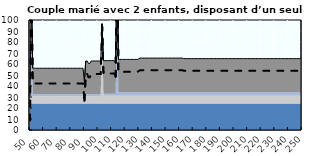
| Category | Coin fiscal marginal (somme des composantes) | Taux d’imposition marginal net |
|---|---|---|
| 50.0 | 30.605 | 8.69 |
| 51.0 | 131.577 | 141.549 |
| 52.0 | 56.131 | 42.277 |
| 53.0 | 56.131 | 42.277 |
| 54.0 | 56.131 | 42.277 |
| 55.0 | 56.131 | 42.277 |
| 56.0 | 56.131 | 42.277 |
| 57.0 | 56.131 | 42.277 |
| 58.0 | 56.131 | 42.277 |
| 59.0 | 56.131 | 42.277 |
| 60.0 | 56.131 | 42.277 |
| 61.0 | 56.131 | 42.277 |
| 62.0 | 56.131 | 42.277 |
| 63.0 | 56.131 | 42.277 |
| 64.0 | 56.131 | 42.277 |
| 65.0 | 56.131 | 42.277 |
| 66.0 | 56.131 | 42.277 |
| 67.0 | 56.131 | 42.277 |
| 68.0 | 56.131 | 42.277 |
| 69.0 | 56.131 | 42.277 |
| 70.0 | 56.131 | 42.277 |
| 71.0 | 56.131 | 42.277 |
| 72.0 | 56.131 | 42.277 |
| 73.0 | 56.131 | 42.277 |
| 74.0 | 56.131 | 42.277 |
| 75.0 | 56.131 | 42.277 |
| 76.0 | 56.131 | 42.277 |
| 77.0 | 56.131 | 42.277 |
| 78.0 | 56.131 | 42.277 |
| 79.0 | 56.131 | 42.277 |
| 80.0 | 56.131 | 42.277 |
| 81.0 | 56.131 | 42.277 |
| 82.0 | 56.131 | 42.277 |
| 83.0 | 56.131 | 42.277 |
| 84.0 | 56.131 | 42.277 |
| 85.0 | 56.131 | 42.277 |
| 86.0 | 56.131 | 42.277 |
| 87.0 | 56.131 | 42.277 |
| 88.0 | 56.131 | 42.277 |
| 89.0 | 56.131 | 42.277 |
| 90.0 | 44.333 | 26.753 |
| 91.0 | 62.743 | 50.977 |
| 92.0 | 62.743 | 50.977 |
| 93.0 | 60.498 | 48.024 |
| 94.0 | 60.498 | 48.024 |
| 95.0 | 62.743 | 50.977 |
| 96.0 | 62.743 | 50.977 |
| 97.0 | 62.743 | 50.977 |
| 98.0 | 62.743 | 50.977 |
| 99.0 | 62.743 | 50.977 |
| 100.0 | 62.743 | 50.977 |
| 101.0 | 62.743 | 50.977 |
| 102.0 | 62.743 | 50.977 |
| 103.0 | 96.691 | 95.646 |
| 104.0 | 63.069 | 51.407 |
| 105.0 | 63.069 | 51.407 |
| 106.0 | 63.069 | 51.407 |
| 107.0 | 63.069 | 51.407 |
| 108.0 | 63.069 | 51.407 |
| 109.0 | 63.069 | 51.407 |
| 110.0 | 63.069 | 51.407 |
| 111.0 | 63.069 | 51.407 |
| 112.0 | 63.069 | 51.407 |
| 113.0 | 60.825 | 48.453 |
| 114.0 | 157.087 | 175.115 |
| 115.0 | 64.17 | 52.855 |
| 116.0 | 64.17 | 52.855 |
| 117.0 | 64.17 | 52.855 |
| 118.0 | 64.17 | 52.855 |
| 119.0 | 64.17 | 52.855 |
| 120.0 | 64.17 | 52.855 |
| 121.0 | 64.17 | 52.855 |
| 122.0 | 64.17 | 52.855 |
| 123.0 | 64.17 | 52.855 |
| 124.0 | 64.17 | 52.855 |
| 125.0 | 64.17 | 52.855 |
| 126.0 | 64.17 | 52.855 |
| 127.0 | 64.17 | 52.855 |
| 128.0 | 64.17 | 52.855 |
| 129.0 | 64.17 | 52.855 |
| 130.0 | 64.716 | 53.573 |
| 131.0 | 65.357 | 54.416 |
| 132.0 | 65.357 | 54.416 |
| 133.0 | 65.357 | 54.416 |
| 134.0 | 65.357 | 54.416 |
| 135.0 | 65.357 | 54.416 |
| 136.0 | 65.357 | 54.416 |
| 137.0 | 65.357 | 54.416 |
| 138.0 | 65.357 | 54.416 |
| 139.0 | 65.357 | 54.416 |
| 140.0 | 65.357 | 54.416 |
| 141.0 | 65.357 | 54.416 |
| 142.0 | 65.357 | 54.416 |
| 143.0 | 65.357 | 54.416 |
| 144.0 | 65.357 | 54.416 |
| 145.0 | 65.357 | 54.416 |
| 146.0 | 65.357 | 54.416 |
| 147.0 | 65.357 | 54.416 |
| 148.0 | 65.357 | 54.416 |
| 149.0 | 65.357 | 54.416 |
| 150.0 | 65.357 | 54.416 |
| 151.0 | 65.357 | 54.416 |
| 152.0 | 65.357 | 54.416 |
| 153.0 | 65.357 | 54.416 |
| 154.0 | 65.357 | 54.416 |
| 155.0 | 65.357 | 54.416 |
| 156.0 | 65.357 | 54.416 |
| 157.0 | 65.357 | 54.416 |
| 158.0 | 65.357 | 54.416 |
| 159.0 | 65.357 | 54.416 |
| 160.0 | 65.357 | 54.416 |
| 161.0 | 65.357 | 54.416 |
| 162.0 | 65.357 | 54.416 |
| 163.0 | 64.97 | 53.907 |
| 164.0 | 64.888 | 53.799 |
| 165.0 | 64.888 | 53.799 |
| 166.0 | 64.888 | 53.799 |
| 167.0 | 64.888 | 53.799 |
| 168.0 | 64.888 | 53.799 |
| 169.0 | 64.888 | 53.799 |
| 170.0 | 64.888 | 53.799 |
| 171.0 | 64.888 | 53.799 |
| 172.0 | 64.888 | 53.799 |
| 173.0 | 64.888 | 53.799 |
| 174.0 | 64.888 | 53.799 |
| 175.0 | 64.888 | 53.799 |
| 176.0 | 64.888 | 53.799 |
| 177.0 | 64.888 | 53.799 |
| 178.0 | 64.888 | 53.799 |
| 179.0 | 64.888 | 53.799 |
| 180.0 | 64.888 | 53.799 |
| 181.0 | 64.888 | 53.799 |
| 182.0 | 64.888 | 53.799 |
| 183.0 | 64.888 | 53.799 |
| 184.0 | 64.888 | 53.799 |
| 185.0 | 64.888 | 53.799 |
| 186.0 | 64.888 | 53.799 |
| 187.0 | 64.888 | 53.799 |
| 188.0 | 64.888 | 53.799 |
| 189.0 | 64.888 | 53.799 |
| 190.0 | 64.888 | 53.799 |
| 191.0 | 64.888 | 53.799 |
| 192.0 | 64.888 | 53.799 |
| 193.0 | 64.888 | 53.799 |
| 194.0 | 64.888 | 53.799 |
| 195.0 | 64.888 | 53.799 |
| 196.0 | 64.888 | 53.799 |
| 197.0 | 64.888 | 53.799 |
| 198.0 | 64.888 | 53.799 |
| 199.0 | 64.888 | 53.799 |
| 200.0 | 64.888 | 53.799 |
| 201.0 | 64.888 | 53.799 |
| 202.0 | 64.888 | 53.799 |
| 203.0 | 64.888 | 53.799 |
| 204.0 | 64.888 | 53.799 |
| 205.0 | 64.888 | 53.799 |
| 206.0 | 64.888 | 53.799 |
| 207.0 | 64.888 | 53.799 |
| 208.0 | 64.888 | 53.799 |
| 209.0 | 64.888 | 53.799 |
| 210.0 | 64.888 | 53.799 |
| 211.0 | 64.888 | 53.799 |
| 212.0 | 64.888 | 53.799 |
| 213.0 | 64.888 | 53.799 |
| 214.0 | 64.888 | 53.799 |
| 215.0 | 64.888 | 53.799 |
| 216.0 | 64.888 | 53.799 |
| 217.0 | 64.888 | 53.799 |
| 218.0 | 64.888 | 53.799 |
| 219.0 | 64.888 | 53.799 |
| 220.0 | 64.888 | 53.799 |
| 221.0 | 64.888 | 53.799 |
| 222.0 | 64.888 | 53.799 |
| 223.0 | 64.888 | 53.799 |
| 224.0 | 64.888 | 53.799 |
| 225.0 | 64.888 | 53.799 |
| 226.0 | 64.888 | 53.799 |
| 227.0 | 64.888 | 53.799 |
| 228.0 | 64.888 | 53.799 |
| 229.0 | 64.888 | 53.799 |
| 230.0 | 64.888 | 53.799 |
| 231.0 | 64.888 | 53.799 |
| 232.0 | 64.888 | 53.799 |
| 233.0 | 64.888 | 53.799 |
| 234.0 | 64.888 | 53.799 |
| 235.0 | 64.888 | 53.799 |
| 236.0 | 64.888 | 53.799 |
| 237.0 | 64.888 | 53.799 |
| 238.0 | 64.888 | 53.799 |
| 239.0 | 64.888 | 53.799 |
| 240.0 | 64.888 | 53.799 |
| 241.0 | 64.888 | 53.799 |
| 242.0 | 64.888 | 53.799 |
| 243.0 | 64.888 | 53.799 |
| 244.0 | 64.888 | 53.799 |
| 245.0 | 64.888 | 53.799 |
| 246.0 | 64.888 | 53.799 |
| 247.0 | 64.888 | 53.799 |
| 248.0 | 64.888 | 53.799 |
| 249.0 | 64.888 | 53.799 |
| 250.0 | 64.888 | 53.799 |